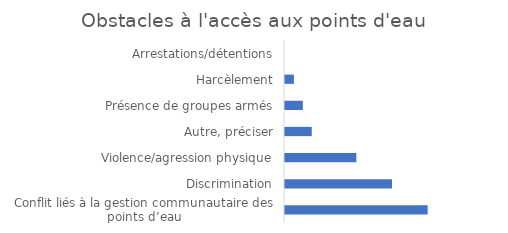
| Category | Fréquence |
|---|---|
| Conflit liés à la gestion communautaire des points d’eau | 0.2 |
| Discrimination | 0.15 |
| Violence/agression physique | 0.1 |
|  Autre, préciser | 0.038 |
| Présence de groupes armés | 0.025 |
| Harcèlement | 0.012 |
| Arrestations/détentions | 0 |